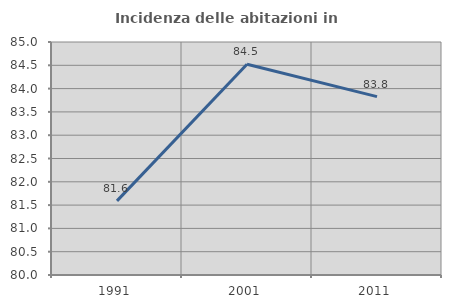
| Category | Incidenza delle abitazioni in proprietà  |
|---|---|
| 1991.0 | 81.59 |
| 2001.0 | 84.522 |
| 2011.0 | 83.828 |